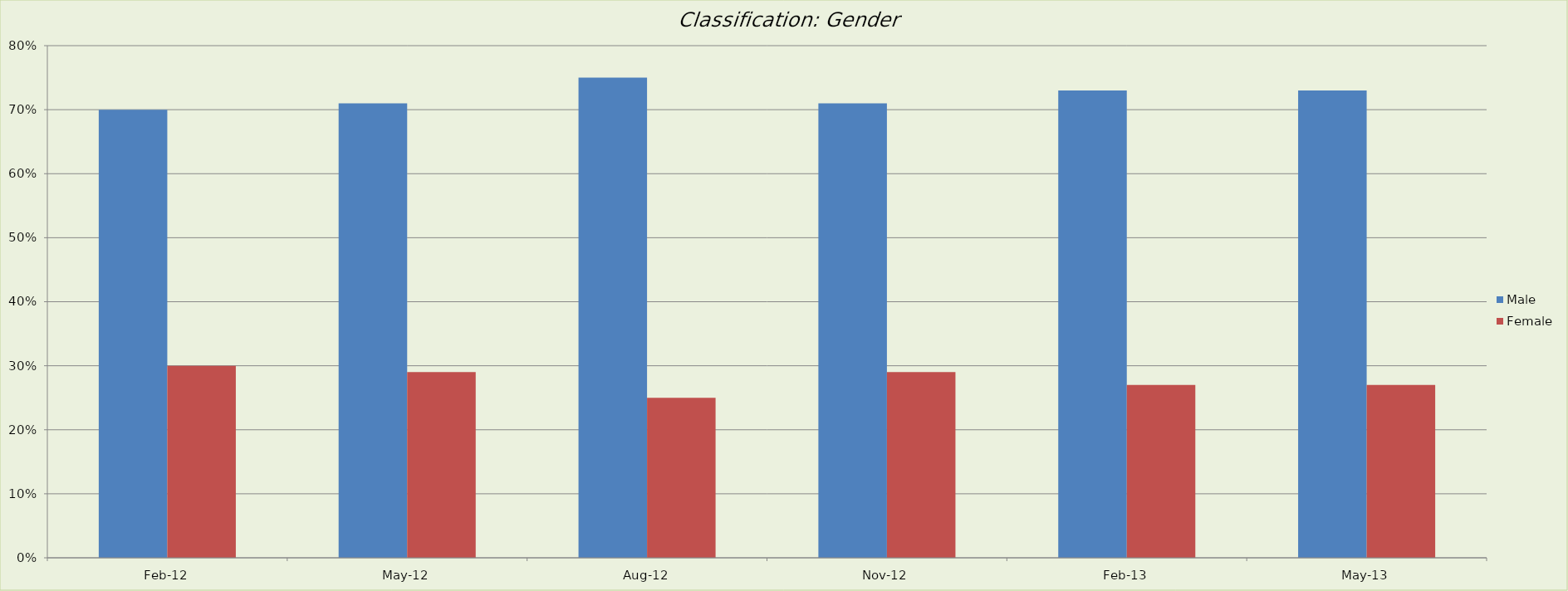
| Category | Male | Female |
|---|---|---|
| 2012-02-01 | 0.7 | 0.3 |
| 2012-05-01 | 0.71 | 0.29 |
| 2012-08-01 | 0.75 | 0.25 |
| 2012-11-01 | 0.71 | 0.29 |
| 2013-02-01 | 0.73 | 0.27 |
| 2013-05-01 | 0.73 | 0.27 |